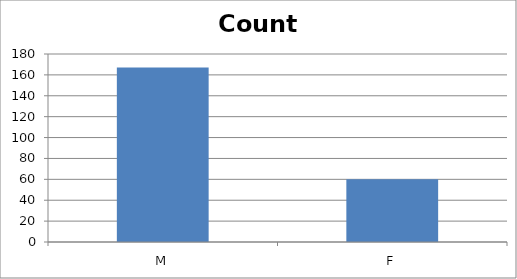
| Category | Count |
|---|---|
| M | 167 |
| F | 60 |